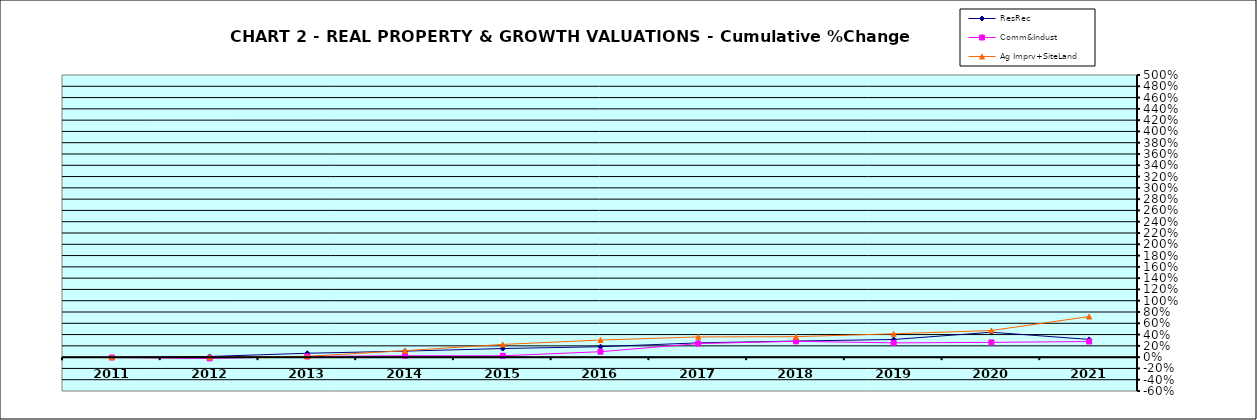
| Category | ResRec | Comm&Indust | Ag Imprv+SiteLand |
|---|---|---|---|
| 2011.0 | -0.004 | -0.007 | 0 |
| 2012.0 | 0.012 | -0.022 | -0.002 |
| 2013.0 | 0.069 | 0.013 | 0.015 |
| 2014.0 | 0.107 | 0.025 | 0.115 |
| 2015.0 | 0.152 | 0.024 | 0.225 |
| 2016.0 | 0.185 | 0.097 | 0.303 |
| 2017.0 | 0.253 | 0.24 | 0.358 |
| 2018.0 | 0.285 | 0.28 | 0.363 |
| 2019.0 | 0.313 | 0.253 | 0.414 |
| 2020.0 | 0.442 | 0.262 | 0.472 |
| 2021.0 | 0.314 | 0.277 | 0.72 |